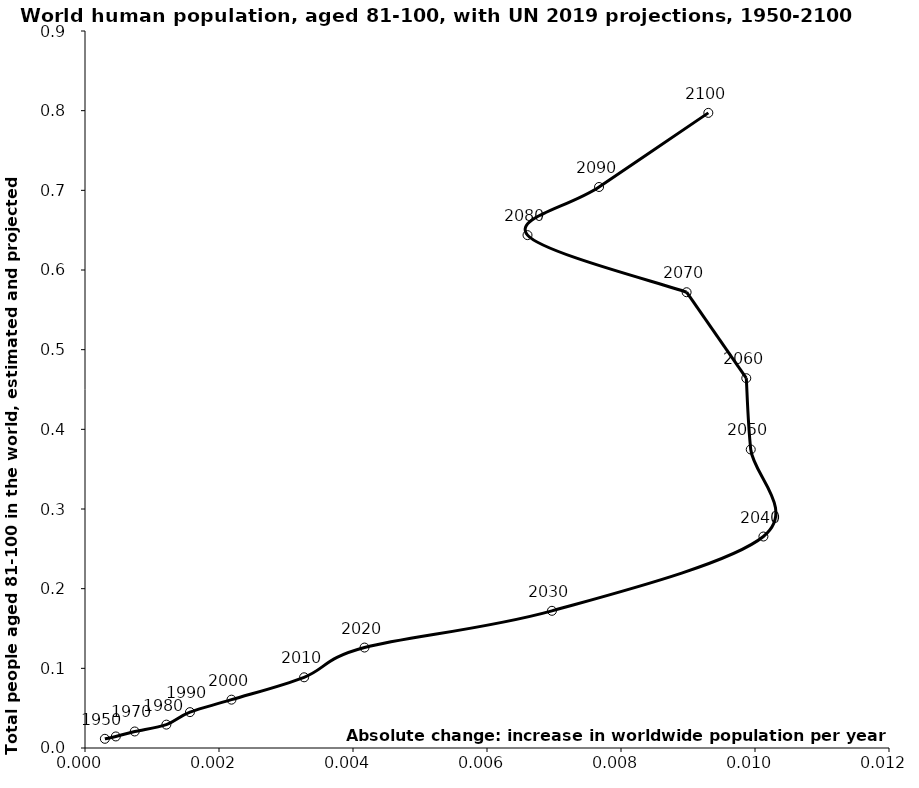
| Category | Series 0 |
|---|---|
| 0.0002965113 | 0.012 |
| 0.0004601259499999997 | 0.015 |
| 0.0007420773000000002 | 0.021 |
| 0.0012143546000000002 | 0.029 |
| 0.001566677549999999 | 0.045 |
| 0.0021863954000000013 | 0.061 |
| 0.003270458550000001 | 0.089 |
| 0.00417183185 | 0.126 |
| 0.006969148399999997 | 0.172 |
| 0.010125561099999996 | 0.265 |
| 0.009936522599999997 | 0.375 |
| 0.009869992350000004 | 0.464 |
| 0.008979171950000007 | 0.572 |
| 0.006604626200000014 | 0.644 |
| 0.007672280300000001 | 0.704 |
| 0.009303409699999977 | 0.797 |